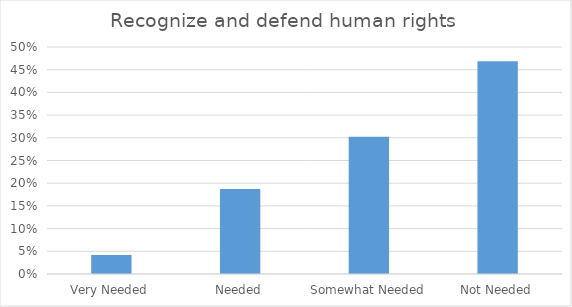
| Category | Recognize and defend human rights  |
|---|---|
| Very Needed | 0.042 |
| Needed | 0.188 |
| Somewhat Needed | 0.302 |
| Not Needed | 0.469 |